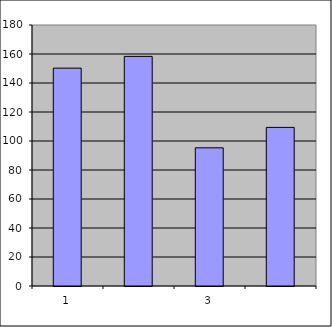
| Category | Series 0 |
|---|---|
| 0 | 150.25 |
| 1 | 158.342 |
| 2 | 95.299 |
| 3 | 109.385 |